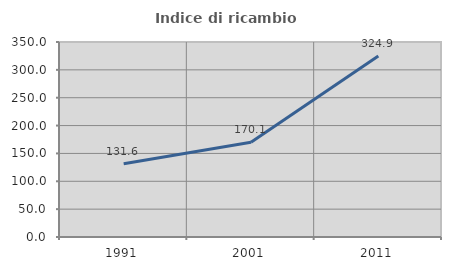
| Category | Indice di ricambio occupazionale  |
|---|---|
| 1991.0 | 131.626 |
| 2001.0 | 170.052 |
| 2011.0 | 324.91 |